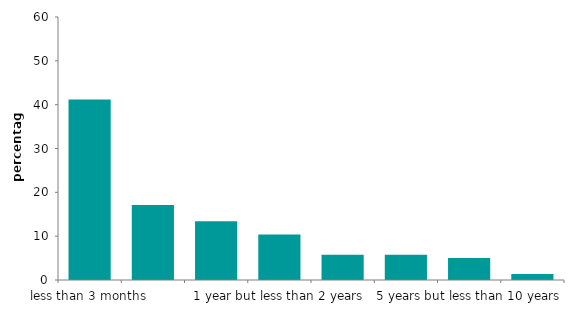
| Category | Series 0 |
|---|---|
| less than 3 months | 41.182 |
| 3 months but less than 6 months | 17.096 |
| 6 months but less than 1 year | 13.411 |
| 1 year but less than 2 years | 10.403 |
| 2 years but less than 3 years | 5.737 |
| 3 years but less than 5 years | 5.756 |
| 5 years but less than 10 years | 5.021 |
| more than 10 years | 1.394 |